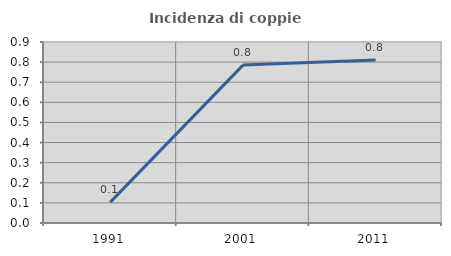
| Category | Incidenza di coppie miste |
|---|---|
| 1991.0 | 0.104 |
| 2001.0 | 0.785 |
| 2011.0 | 0.811 |